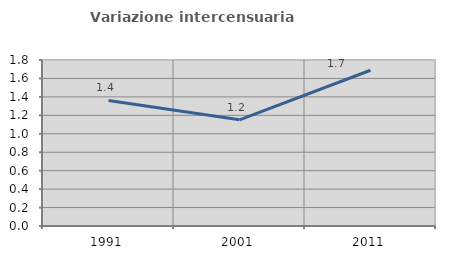
| Category | Variazione intercensuaria annua |
|---|---|
| 1991.0 | 1.361 |
| 2001.0 | 1.152 |
| 2011.0 | 1.689 |